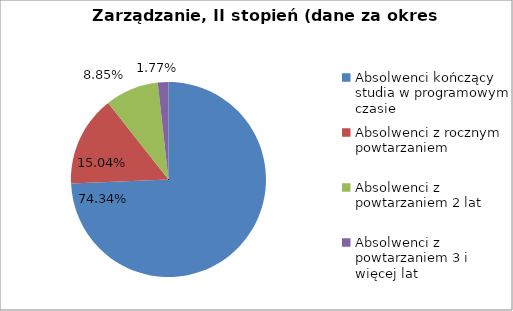
| Category | Series 0 |
|---|---|
| Absolwenci kończący studia w programowym czasie | 74.336 |
| Absolwenci z rocznym powtarzaniem | 15.044 |
| Absolwenci z powtarzaniem 2 lat | 8.85 |
| Absolwenci z powtarzaniem 3 i więcej lat | 1.77 |